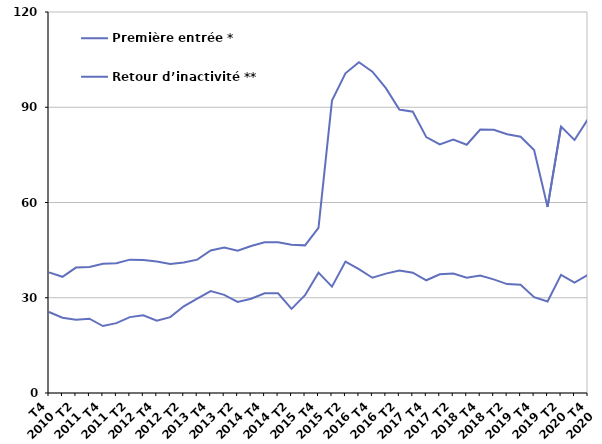
| Category | Première entrée * | Retour d’inactivité ** |
|---|---|---|
| T4
2010 | 25.5 | 38 |
| T1
2011 | 23.7 | 36.6 |
| T2
2011 | 23.1 | 39.5 |
| T3
2011 | 23.4 | 39.7 |
| T4
2011 | 21.1 | 40.7 |
| T1
2012 | 22 | 40.9 |
| T2
2012 | 23.9 | 42 |
| T3
2012 | 24.5 | 41.9 |
| T4
2012 | 22.8 | 41.4 |
| T1
2013 | 23.9 | 40.6 |
| T2
2013 | 27.3 | 41.1 |
| T3
2013 | 29.7 | 42 |
| T4
2013 | 32.1 | 44.9 |
| T1
2014 | 30.9 | 45.8 |
| T2
2014 | 28.7 | 44.8 |
| T3
2014 | 29.7 | 46.3 |
| T4
2014 | 31.4 | 47.5 |
| T1
2015 | 31.4 | 47.5 |
| T2
2015 | 26.5 | 46.7 |
| T3
2015 | 30.8 | 46.5 |
| T4
2015 | 37.9 | 52 |
| T1
2016 | 33.5 | 92.1 |
| T2
2016 | 41.4 | 100.7 |
| T3
2016 | 39 | 104.2 |
| T4
2016 | 36.3 | 101.2 |
| T1
2017 | 37.6 | 96 |
| T2
2017 | 38.6 | 89.3 |
| T3
2017 | 37.9 | 88.6 |
| T4
2017 | 35.5 | 80.6 |
| T1
2018 | 37.4 | 78.3 |
| T2
2018 | 37.6 | 79.8 |
| T3
2018 | 36.3 | 78.2 |
| T4
2018 | 37 | 83 |
| T1
2019 | 35.8 | 82.9 |
| T2
2019 | 34.3 | 81.5 |
| T3
2019 | 34.1 | 80.7 |
| T4
2019 | 30.2 | 76.5 |
| T1
2020 | 28.8 | 58.6 |
| T2
2020 | 37.2 | 83.9 |
| T3
2020 | 34.8 | 79.7 |
| T4
2020 | 37.2 | 86.3 |